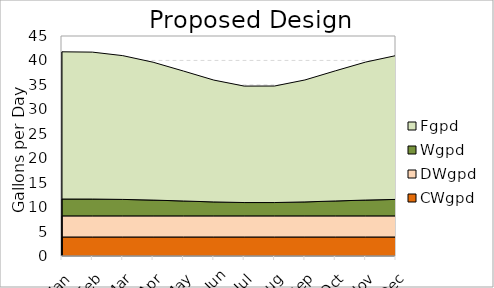
| Category | CWgpd | DWgpd | Wgpd | Fgpd |
|---|---|---|---|---|
| Jan | 3.889 | 4.317 | 3.449 | 30.112 |
| Feb | 3.889 | 4.317 | 3.442 | 30.056 |
| Mar | 3.889 | 4.317 | 3.368 | 29.409 |
| Apr | 3.889 | 4.317 | 3.23 | 28.203 |
| May | 3.889 | 4.317 | 3.045 | 26.583 |
| Jun | 3.889 | 4.317 | 2.854 | 24.922 |
| Jul | 3.889 | 4.317 | 2.728 | 23.822 |
| Aug | 3.889 | 4.317 | 2.73 | 23.832 |
| Sep | 3.889 | 4.317 | 2.857 | 24.944 |
| Oct | 3.889 | 4.317 | 3.048 | 26.613 |
| Nov | 3.889 | 4.317 | 3.233 | 28.227 |
| Dec | 3.889 | 4.317 | 3.37 | 29.422 |